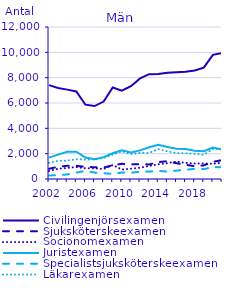
| Category | Civilingenjörsexamen                               | Sjuksköterskeexamen                                | Socionomexamen                                     | Juristexamen                                       | Specialistsjuksköterskeexamen                      | Läkarexamen                                        |
|---|---|---|---|---|---|---|
| 2002.0 | 7413 | 809 | 631 | 1689 | 279 | 1283 |
| 2003.0 | 7186 | 962 | 808 | 1921 | 302 | 1428 |
| 2004.0 | 7055 | 1042 | 875 | 2147 | 357 | 1450 |
| 2005.0 | 6910 | 1035 | 942 | 2159 | 498 | 1561 |
| 2006.0 | 5866 | 966 | 848 | 1691 | 648 | 1540 |
| 2007.0 | 5761 | 928 | 844 | 1563 | 503 | 1544 |
| 2008.0 | 6111 | 901 | 792 | 1714 | 463 | 1661 |
| 2009.0 | 7223 | 1081 | 1107 | 2030 | 398 | 1936 |
| 2010.0 | 6976 | 1201 | 750 | 2275 | 510 | 2183 |
| 2011.0 | 7330 | 1153 | 812 | 2090 | 499 | 1970 |
| 2012.0 | 7942 | 1174 | 891 | 2262 | 571 | 2059 |
| 2013.0 | 8276 | 1150 | 1029 | 2507 | 588 | 2055 |
| 2014.0 | 8282 | 1333 | 1165 | 2706 | 638 | 2361 |
| 2015.0 | 8387 | 1405 | 1248 | 2531 | 582 | 2188 |
| 2016.0 | 8430 | 1244 | 1374 | 2381 | 663 | 2042 |
| 2017.0 | 8465 | 1127 | 1273 | 2364 | 724 | 2030 |
| 2018.0 | 8566 | 1009 | 1224 | 2238 | 807 | 1985 |
| 2019.0 | 8790 | 1076 | 1231 | 2188 | 778 | 1922 |
| 2020.0 | 9800 | 1357 | 1203 | 2486 | 946 | 2363 |
| 2021.0 | 9951 | 1487 | 1295 | 2335 | 927 | 2349 |